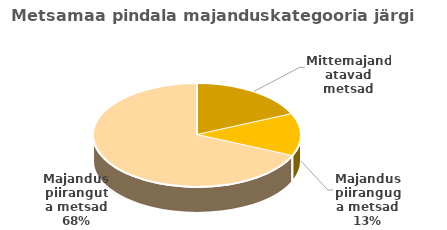
| Category | Series 0 |
|---|---|
| Mittemajandatavad metsad | 429.61 |
| Majandus piiranguga metsad | 308.454 |
| Majandus piiranguta metsad | 1596.113 |